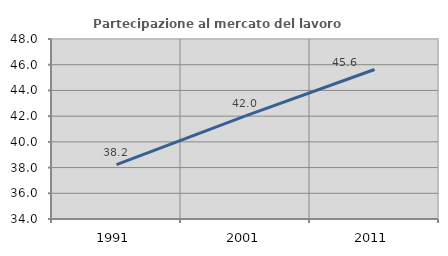
| Category | Partecipazione al mercato del lavoro  femminile |
|---|---|
| 1991.0 | 38.234 |
| 2001.0 | 42.019 |
| 2011.0 | 45.625 |